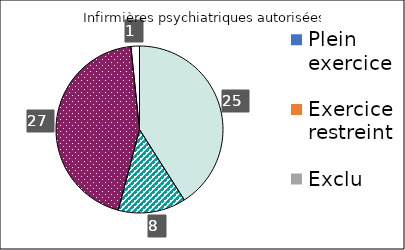
| Category | Infirmières psychiatriques autorisées | Infirmières praticiennes | Infirmières autorisées |
|---|---|---|---|
| Plein exercice | 25 | 0 | 24 |
| Exercice restreint | 8 | 0 | 18 |
| Exclu | 27 | 0 | 19 |
| Non disponible/
sans objet | 1 | 0 | 0 |